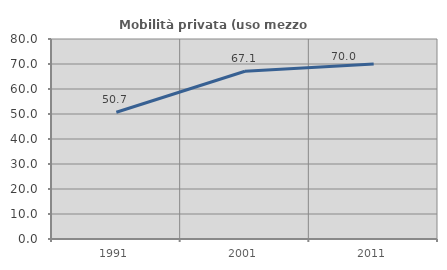
| Category | Mobilità privata (uso mezzo privato) |
|---|---|
| 1991.0 | 50.694 |
| 2001.0 | 67.087 |
| 2011.0 | 70.027 |